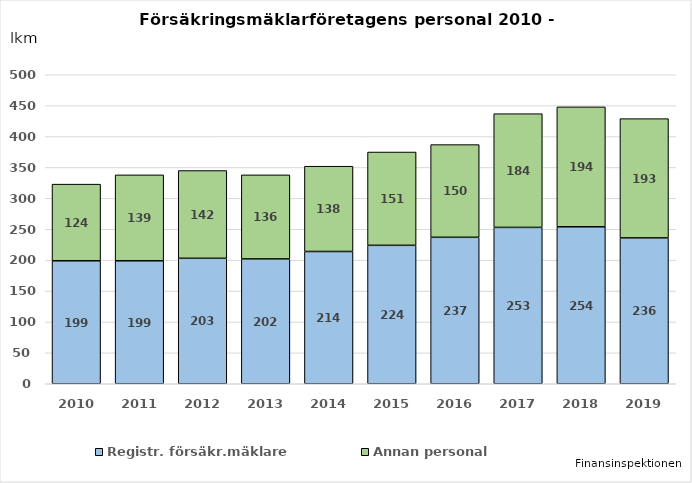
| Category | Registr. försäkr.mäklare | Annan personal |
|---|---|---|
| 2010.0 | 199 | 124 |
| 2011.0 | 199 | 139 |
| 2012.0 | 203 | 142 |
| 2013.0 | 202 | 136 |
| 2014.0 | 214 | 138 |
| 2015.0 | 224 | 151 |
| 2016.0 | 237 | 150 |
| 2017.0 | 253 | 184 |
| 2018.0 | 254 | 194 |
| 2019.0 | 236 | 193 |